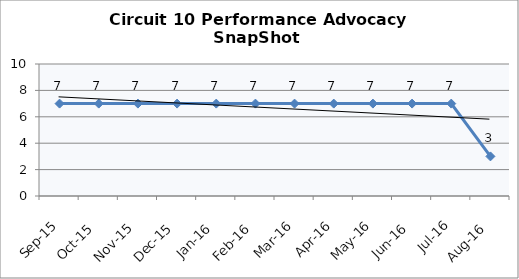
| Category | Circuit 10 |
|---|---|
| Sep-15 | 7 |
| Oct-15 | 7 |
| Nov-15 | 7 |
| Dec-15 | 7 |
| Jan-16 | 7 |
| Feb-16 | 7 |
| Mar-16 | 7 |
| Apr-16 | 7 |
| May-16 | 7 |
| Jun-16 | 7 |
| Jul-16 | 7 |
| Aug-16 | 3 |